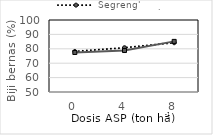
| Category | Segreng' | Cempo Merah' |
|---|---|---|
| 0.0 | 78.16 | 77.44 |
| 4.0 | 80.75 | 78.8 |
| 8.0 | 84.22 | 85.15 |